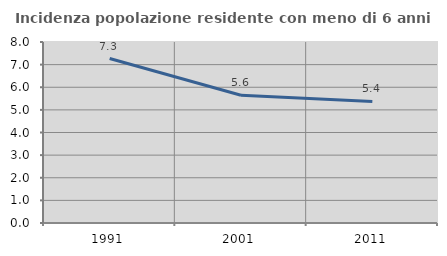
| Category | Incidenza popolazione residente con meno di 6 anni |
|---|---|
| 1991.0 | 7.268 |
| 2001.0 | 5.645 |
| 2011.0 | 5.373 |